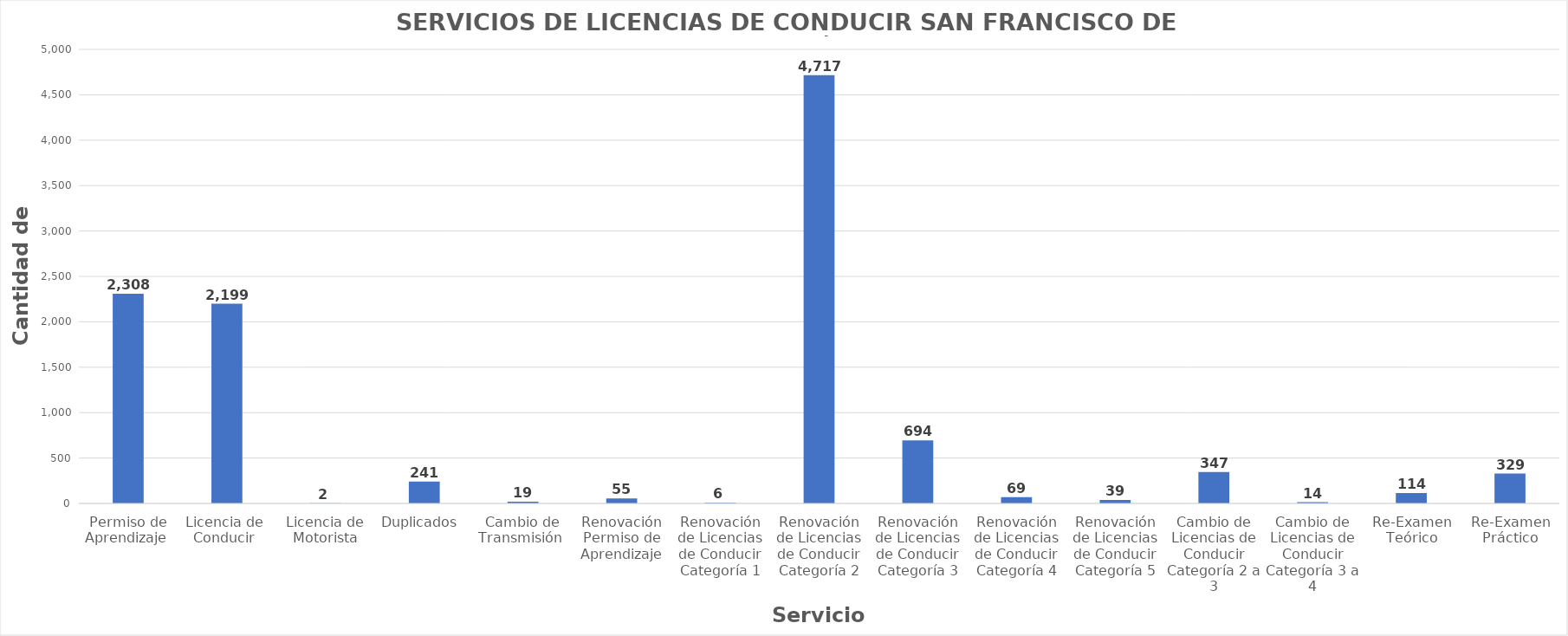
| Category | Series 0 |
|---|---|
| Permiso de Aprendizaje  | 2308 |
| Licencia de  Conducir  | 2199 |
| Licencia de Motorista | 2 |
| Duplicados  | 241 |
| Cambio de Transmisión  | 19 |
| Renovación Permiso de Aprendizaje | 55 |
| Renovación de Licencias de Conducir Categoría 1 | 6 |
| Renovación de Licencias de Conducir Categoría 2 | 4717 |
| Renovación de Licencias de Conducir Categoría 3 | 694 |
| Renovación de Licencias de Conducir Categoría 4 | 69 |
| Renovación de Licencias de Conducir Categoría 5 | 39 |
| Cambio de Licencias de Conducir Categoría 2 a 3 | 347 |
| Cambio de Licencias de Conducir Categoría 3 a 4 | 14 |
| Re-Examen Teórico | 114 |
| Re-Examen Práctico | 329 |